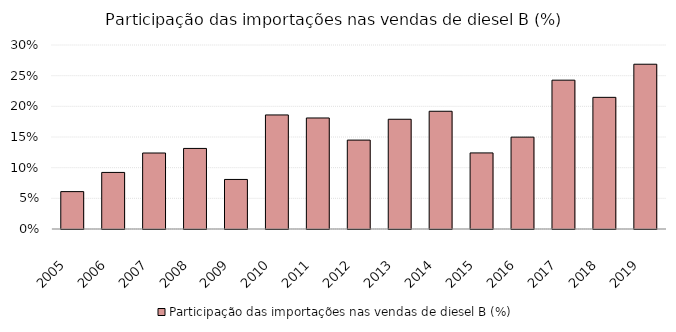
| Category | Participação das importações nas vendas de diesel B (%) |
|---|---|
| 2005.0 | 0.061 |
| 2006.0 | 0.092 |
| 2007.0 | 0.124 |
| 2008.0 | 0.131 |
| 2009.0 | 0.081 |
| 2010.0 | 0.186 |
| 2011.0 | 0.181 |
| 2012.0 | 0.145 |
| 2013.0 | 0.179 |
| 2014.0 | 0.192 |
| 2015.0 | 0.124 |
| 2016.0 | 0.15 |
| 2017.0 | 0.243 |
| 2018.0 | 0.215 |
| 2019.0 | 0.269 |